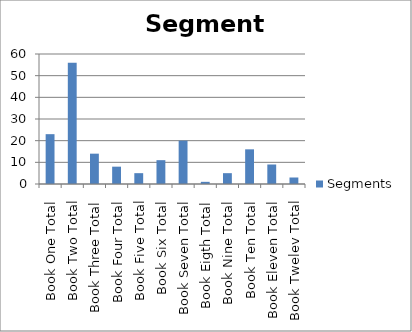
| Category | Segments |
|---|---|
| Book One Total | 23 |
| Book Two Total | 56 |
| Book Three Total | 14 |
| Book Four Total | 8 |
| Book Five Total | 5 |
| Book Six Total | 11 |
| Book Seven Total | 20 |
| Book Eigth Total | 1 |
| Book Nine Total | 5 |
| Book Ten Total | 16 |
| Book Eleven Total | 9 |
| Book Twelev Total | 3 |